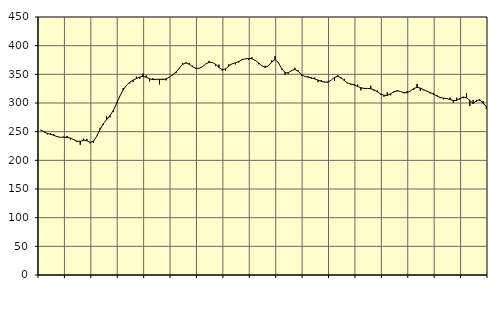
| Category | Piggar | Series 1 |
|---|---|---|
| nan | 252.4 | 253.02 |
| 87.0 | 250.3 | 249.66 |
| 87.0 | 245.3 | 246.95 |
| 87.0 | 247.5 | 245.33 |
| nan | 245.7 | 243.61 |
| 88.0 | 240.7 | 241.26 |
| 88.0 | 240.2 | 240.21 |
| 88.0 | 241.3 | 240.27 |
| nan | 242.5 | 240.1 |
| 89.0 | 236.2 | 238.89 |
| 89.0 | 237.1 | 236.08 |
| 89.0 | 231.8 | 233.23 |
| nan | 227.2 | 233.14 |
| 90.0 | 238 | 234.91 |
| 90.0 | 237.3 | 234.18 |
| 90.0 | 229.6 | 231.3 |
| nan | 230.9 | 233.17 |
| 91.0 | 242.8 | 242.17 |
| 91.0 | 256.7 | 253.99 |
| 91.0 | 261.8 | 264.04 |
| nan | 276.6 | 271.22 |
| 92.0 | 274.8 | 278.05 |
| 92.0 | 284.8 | 286.91 |
| 92.0 | 301 | 299.06 |
| nan | 312.2 | 312.14 |
| 93.0 | 326.2 | 322.94 |
| 93.0 | 330.1 | 330.84 |
| 93.0 | 334.2 | 336.45 |
| nan | 336.4 | 340.04 |
| 94.0 | 345.9 | 342.6 |
| 94.0 | 342.2 | 345.29 |
| 94.0 | 351.4 | 346.49 |
| nan | 348.1 | 344.98 |
| 95.0 | 337.7 | 342.19 |
| 95.0 | 343.4 | 340.79 |
| 95.0 | 340.9 | 341.26 |
| nan | 332.5 | 341.4 |
| 96.0 | 342.3 | 340.98 |
| 96.0 | 339.5 | 342.11 |
| 96.0 | 344.9 | 345.15 |
| nan | 349.8 | 349.09 |
| 97.0 | 352.2 | 354.08 |
| 97.0 | 360.1 | 360.7 |
| 97.0 | 369.5 | 367.34 |
| nan | 371 | 369.87 |
| 98.0 | 369.6 | 367.49 |
| 98.0 | 365.1 | 363.4 |
| 98.0 | 359.5 | 360.62 |
| nan | 360 | 360.34 |
| 99.0 | 363.8 | 363.5 |
| 99.0 | 368.1 | 368.06 |
| 99.0 | 373.5 | 370.96 |
| nan | 371.3 | 370.71 |
| 0.0 | 364.3 | 367.31 |
| 0.0 | 367 | 362.07 |
| 0.0 | 356.4 | 358.19 |
| nan | 356.6 | 359.5 |
| 1.0 | 367.8 | 364.46 |
| 1.0 | 368.1 | 368.36 |
| 1.0 | 367.4 | 370.01 |
| nan | 370.5 | 372.42 |
| 2.0 | 377 | 375.5 |
| 2.0 | 377 | 377.01 |
| 2.0 | 375.2 | 377.69 |
| nan | 379.9 | 377.23 |
| 3.0 | 374.5 | 374.29 |
| 3.0 | 367.8 | 369.79 |
| 3.0 | 365.3 | 364.87 |
| nan | 365 | 362.07 |
| 4.0 | 366 | 364.72 |
| 4.0 | 374.4 | 371.59 |
| 4.0 | 381.9 | 375.72 |
| nan | 369.9 | 370.67 |
| 5.0 | 358.4 | 360.18 |
| 5.0 | 349.2 | 353.02 |
| 5.0 | 350.7 | 352.57 |
| nan | 355.6 | 356.63 |
| 6.0 | 361.5 | 358.69 |
| 6.0 | 356.8 | 355.2 |
| 6.0 | 347.4 | 349.74 |
| nan | 346.1 | 346.21 |
| 7.0 | 346.6 | 345.1 |
| 7.0 | 342.7 | 343.99 |
| 7.0 | 344.5 | 341.96 |
| nan | 336.4 | 339.9 |
| 8.0 | 340.1 | 337.77 |
| 8.0 | 337 | 336.22 |
| 8.0 | 335.2 | 336.73 |
| nan | 339.8 | 339.83 |
| 9.0 | 338.9 | 344.52 |
| 9.0 | 348.4 | 346.54 |
| 9.0 | 342.7 | 344.02 |
| nan | 342 | 339.06 |
| 10.0 | 334.3 | 334.9 |
| 10.0 | 331.7 | 332.92 |
| 10.0 | 333.2 | 331.33 |
| nan | 332.1 | 328.9 |
| 11.0 | 322.1 | 326.61 |
| 11.0 | 324.5 | 325.47 |
| 11.0 | 325.3 | 325.39 |
| nan | 330.1 | 324.84 |
| 12.0 | 321.6 | 322.81 |
| 12.0 | 321.9 | 319.36 |
| 12.0 | 314.6 | 315.7 |
| nan | 310.9 | 313.4 |
| 13.0 | 318.6 | 313.29 |
| 13.0 | 313.4 | 315.95 |
| 13.0 | 318.6 | 319.61 |
| nan | 320.1 | 321.43 |
| 14.0 | 320.4 | 320.06 |
| 14.0 | 317 | 317.9 |
| 14.0 | 320.9 | 317.85 |
| nan | 320.9 | 320.91 |
| 15.0 | 323 | 325.27 |
| 15.0 | 333.3 | 327.31 |
| 15.0 | 321.2 | 326.06 |
| nan | 322.3 | 323.04 |
| 16.0 | 320.7 | 320.55 |
| 16.0 | 316.6 | 318.19 |
| 16.0 | 317.7 | 315.31 |
| nan | 313.9 | 312.28 |
| 17.0 | 308.5 | 309.61 |
| 17.0 | 306.5 | 308.46 |
| 17.0 | 308.7 | 307.79 |
| nan | 309.4 | 306.08 |
| 18.0 | 300.4 | 304.33 |
| 18.0 | 309.3 | 304.49 |
| 18.0 | 305.9 | 307.83 |
| nan | 308.4 | 310.51 |
| 19.0 | 316.9 | 309.13 |
| 19.0 | 294.7 | 304.58 |
| 19.0 | 305.3 | 298.67 |
| nan | 301.9 | 304.2 |
| 20.0 | 303.4 | 305.81 |
| 20.0 | 303.6 | 299.32 |
| 20.0 | 289.4 | 293.97 |